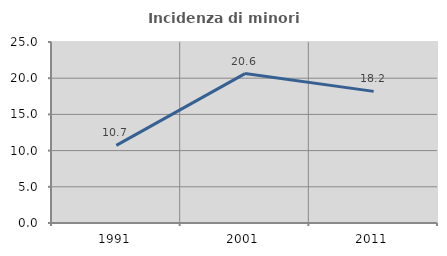
| Category | Incidenza di minori stranieri |
|---|---|
| 1991.0 | 10.714 |
| 2001.0 | 20.635 |
| 2011.0 | 18.182 |